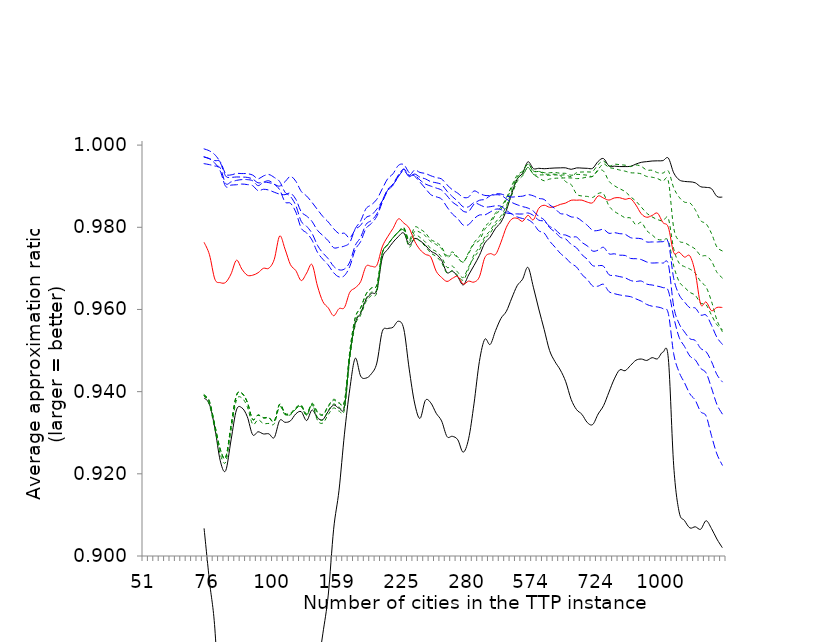
| Category | S1 | S5 | C3 | C4 | C5 | C6 | MATLS | MMASls3boost | MMASls3 | MMASls4boost | MMASls4 |
|---|---|---|---|---|---|---|---|---|---|---|---|
| 51.0 | 0.946 | 0.999 | 0.999 | 0.999 | 0.999 | 1 | 0.98 | 1 | 0.999 | 1 | 0.999 |
| 51.0 | 0.866 | 1 | 1 | 1 | 1 | 1 | 0.956 | 1 | 1 | 1 | 1 |
| 51.0 | 0.866 | 0.9 | 0.9 | 0.9 | 0.9 | 0.901 | 0.997 | 0.988 | 0.988 | 0.998 | 0.994 |
| 51.0 | 0.89 | 0.898 | 0.898 | 0.898 | 0.898 | 0.898 | 0.999 | 1 | 1 | 1 | 1 |
| 51.0 | 0.84 | 0.855 | 0.855 | 0.856 | 0.855 | 0.856 | 0.971 | 1 | 0.991 | 1 | 0.991 |
| 51.0 | 0.856 | 0.857 | 0.857 | 0.857 | 0.857 | 0.857 | 0.942 | 0.996 | 0.996 | 0.997 | 0.996 |
| 51.0 | 0.982 | 0.992 | 0.993 | 0.993 | 0.993 | 0.993 | 0.973 | 1 | 0.996 | 1 | 0.996 |
| 51.0 | 0.925 | 0.967 | 0.967 | 0.967 | 0.967 | 0.967 | 0.94 | 1 | 1 | 1 | 1 |
| 51.0 | 0.932 | 0.956 | 0.96 | 0.96 | 0.96 | 0.96 | 0.997 | 1 | 0.996 | 1 | 0.996 |
| 51.0 | 0.908 | 0.925 | 0.925 | 0.925 | 0.925 | 0.925 | 0.993 | 1 | 1 | 1 | 1 |
| 51.0 | 0.945 | 0.959 | 0.961 | 0.961 | 0.961 | 0.961 | 0.975 | 0.992 | 0.99 | 0.997 | 0.995 |
| 51.0 | 0.925 | 0.953 | 0.953 | 0.953 | 0.953 | 0.953 | 0.995 | 0.991 | 0.991 | 0.996 | 0.997 |
| 76.0 | 0.792 | 0.98 | 0.98 | 0.971 | 0.98 | 0.981 | 0.943 | 0.994 | 0.996 | 0.994 | 0.993 |
| 76.0 | 0.726 | 0.93 | 0.93 | 0.93 | 0.93 | 0.93 | 0.885 | 0.994 | 0.996 | 0.989 | 0.987 |
| 76.0 | 0.575 | 0.804 | 0.831 | 0.827 | 0.831 | 0.831 | 0.987 | 0.985 | 0.982 | 0.976 | 0.971 |
| 76.0 | 0.602 | 0.869 | 0.874 | 0.874 | 0.874 | 0.874 | 1 | 0.964 | 0.955 | 0.96 | 0.955 |
| 76.0 | 0.882 | 0.945 | 0.949 | 0.949 | 0.949 | 0.949 | 0.996 | 0.997 | 0.996 | 0.996 | 0.995 |
| 76.0 | 0.876 | 0.944 | 0.944 | 0.944 | 0.944 | 0.944 | 0.981 | 1 | 1 | 0.998 | 0.997 |
| 76.0 | 0.889 | 0.998 | 0.999 | 0.999 | 0.999 | 0.999 | 0.947 | 1 | 0.998 | 1 | 0.998 |
| 76.0 | 0.757 | 0.942 | 0.942 | 0.942 | 0.942 | 0.942 | 0.922 | 1 | 1 | 0.999 | 0.998 |
| 76.0 | 0.736 | 0.903 | 0.91 | 0.909 | 0.91 | 0.91 | 0.997 | 0.996 | 0.992 | 0.995 | 0.992 |
| 76.0 | 0.817 | 0.933 | 0.938 | 0.938 | 0.938 | 0.938 | 1 | 0.989 | 0.986 | 0.989 | 0.985 |
| 76.0 | 0.856 | 0.953 | 0.953 | 0.95 | 0.953 | 0.953 | 0.988 | 1 | 1 | 0.999 | 0.999 |
| 76.0 | 0.775 | 0.954 | 0.954 | 0.954 | 0.954 | 0.954 | 0.995 | 0.995 | 0.995 | 0.995 | 0.995 |
| 100.0 | 0.844 | 0.97 | 0.97 | 0.97 | 0.97 | 0.971 | 0.969 | 0.986 | 0.986 | 0.989 | 0.987 |
| 100.0 | 0.796 | 0.98 | 0.98 | 0.98 | 0.98 | 0.98 | 0.953 | 0.982 | 0.98 | 0.983 | 0.982 |
| 100.0 | 0.799 | 0.799 | 0.802 | 0.803 | 0.803 | 0.804 | 0.948 | 0.954 | 0.946 | 0.989 | 0.969 |
| 100.0 | 0.871 | 0.873 | 0.874 | 0.875 | 0.874 | 0.875 | 0.955 | 0.952 | 0.951 | 0.976 | 0.96 |
| 100.0 | 0.966 | 0.966 | 0.965 | 0.966 | 0.966 | 0.966 | 0.978 | 0.971 | 0.97 | 0.982 | 0.977 |
| 100.0 | 0.951 | 0.951 | 0.952 | 0.952 | 0.952 | 0.952 | 0.952 | 0.954 | 0.953 | 0.969 | 0.961 |
| 100.0 | 0.968 | 0.972 | 0.973 | 0.973 | 0.973 | 0.974 | 0.968 | 0.985 | 0.985 | 0.986 | 0.986 |
| 100.0 | 0.947 | 0.972 | 0.972 | 0.972 | 0.972 | 0.972 | 0.947 | 0.979 | 0.979 | 0.981 | 0.983 |
| 100.0 | 0.875 | 0.88 | 0.864 | 0.873 | 0.885 | 0.885 | 0.934 | 0.961 | 0.957 | 0.975 | 0.966 |
| 100.0 | 0.927 | 0.928 | 0.929 | 0.929 | 0.929 | 0.929 | 0.954 | 0.967 | 0.965 | 0.969 | 0.97 |
| 100.0 | 0.969 | 0.977 | 0.978 | 0.978 | 0.978 | 0.978 | 0.97 | 0.983 | 0.983 | 0.983 | 0.984 |
| 100.0 | 0.967 | 0.972 | 0.973 | 0.973 | 0.973 | 0.973 | 0.972 | 0.973 | 0.973 | 0.975 | 0.975 |
| 159.0 | 0.958 | 0.96 | 0.961 | 0.961 | 0.961 | 0.961 | 0.99 | 0.976 | 0.973 | 0.975 | 0.989 |
| 159.0 | 0.959 | 0.984 | 0.984 | 0.984 | 0.984 | 0.984 | 0.956 | 0.984 | 0.984 | 0.984 | 0.985 |
| 159.0 | 0.932 | 0.95 | 0.95 | 0.95 | 0.95 | 0.95 | 0.993 | 0.974 | 0.973 | 0.976 | 0.98 |
| 159.0 | 0.96 | 0.968 | 0.972 | 0.972 | 0.972 | 0.972 | 0.968 | 1 | 1 | 1 | 1 |
| 159.0 | 0.914 | 0.994 | 0.995 | 0.995 | 0.995 | 0.995 | 0.996 | 0.995 | 0.994 | 0.995 | 1 |
| 159.0 | 0.945 | 0.991 | 0.991 | 0.991 | 0.991 | 0.991 | 0.997 | 0.991 | 0.991 | 0.991 | 0.997 |
| 159.0 | 0.98 | 0.991 | 0.991 | 0.991 | 0.991 | 0.991 | 0.969 | 0.997 | 0.999 | 0.993 | 0.997 |
| 159.0 | 0.978 | 0.981 | 0.982 | 0.982 | 0.982 | 0.982 | 0.95 | 0.998 | 1 | 0.998 | 0.999 |
| 159.0 | 0.967 | 0.975 | 0.978 | 0.978 | 0.978 | 0.978 | 0.988 | 0.999 | 0.997 | 0.998 | 0.997 |
| 159.0 | 0.936 | 0.953 | 0.954 | 0.954 | 0.954 | 0.954 | 0.984 | 1 | 1 | 1 | 1 |
| 159.0 | 0.973 | 0.998 | 0.999 | 0.999 | 0.999 | 0.999 | 0.995 | 0.999 | 0.999 | 0.999 | 0.999 |
| 159.0 | 0.985 | 0.989 | 0.989 | 0.989 | 0.989 | 0.989 | 1 | 0.999 | 0.999 | 0.999 | 0.999 |
| 225.0 | 0.935 | 0.97 | 0.969 | 0.965 | 0.971 | 0.974 | 0.978 | 0.992 | 0.995 | 0.991 | 0.991 |
| 225.0 | 0.842 | 0.949 | 0.946 | 0.936 | 0.947 | 0.948 | 0.942 | 0.967 | 0.964 | 0.967 | 0.962 |
| 225.0 | 0.832 | 0.968 | 0.972 | 0.977 | 0.979 | 0.987 | 0.955 | 0.99 | 0.975 | 0.983 | 0.97 |
| 225.0 | 0.915 | 0.961 | 0.964 | 0.963 | 0.97 | 0.966 | 0.943 | 0.993 | 0.985 | 0.99 | 0.982 |
| 225.0 | 0.967 | 0.981 | 0.981 | 0.979 | 0.984 | 0.984 | 0.982 | 0.992 | 0.983 | 0.99 | 0.981 |
| 225.0 | 0.937 | 0.973 | 0.973 | 0.972 | 0.975 | 0.972 | 0.989 | 0.985 | 0.985 | 0.983 | 0.979 |
| 225.0 | 0.95 | 0.982 | 0.983 | 0.981 | 0.982 | 0.983 | 0.927 | 0.991 | 0.994 | 0.99 | 0.991 |
| 225.0 | 0.955 | 0.963 | 0.965 | 0.964 | 0.969 | 0.968 | 0.931 | 0.994 | 0.994 | 0.992 | 0.992 |
| 225.0 | 0.921 | 0.939 | 0.948 | 0.947 | 0.952 | 0.952 | 0.976 | 0.982 | 0.981 | 0.979 | 0.974 |
| 225.0 | 0.936 | 0.957 | 0.958 | 0.961 | 0.966 | 0.965 | 0.993 | 0.986 | 0.981 | 0.984 | 0.979 |
| 225.0 | 0.963 | 0.981 | 0.981 | 0.985 | 0.986 | 0.984 | 1 | 0.989 | 0.988 | 0.985 | 0.985 |
| 225.0 | 0.949 | 0.965 | 0.974 | 0.976 | 0.976 | 0.975 | 0.978 | 0.987 | 0.984 | 0.983 | 0.981 |
| 280.0 | 0.974 | 0.999 | 0.999 | 0.998 | 1 | 0.999 | 0.986 | 0.993 | 0.994 | 0.992 | 0.992 |
| 280.0 | 0.945 | 0.977 | 0.974 | 0.977 | 0.976 | 0.976 | 0.939 | 0.985 | 0.986 | 0.979 | 0.979 |
| 280.0 | 0.956 | 0.997 | 0.994 | 0.999 | 0.997 | 0.998 | 0.97 | 0.983 | 0.986 | 0.978 | 0.981 |
| 280.0 | 0.98 | 0.998 | 0.996 | 0.993 | 0.998 | 0.998 | 0.999 | 0.987 | 0.987 | 0.984 | 0.982 |
| 280.0 | 0.951 | 0.999 | 0.999 | 0.998 | 1 | 0.999 | 0.994 | 0.991 | 0.993 | 0.991 | 0.99 |
| 280.0 | 0.978 | 1 | 0.997 | 0.997 | 1 | 0.999 | 0.987 | 0.987 | 0.99 | 0.986 | 0.987 |
| 280.0 | 0.986 | 0.999 | 0.999 | 0.999 | 0.999 | 0.999 | 0.963 | 0.99 | 0.993 | 0.989 | 0.99 |
| 280.0 | 0.976 | 0.998 | 0.997 | 0.993 | 0.996 | 0.996 | 0.975 | 0.984 | 0.988 | 0.98 | 0.982 |
| 280.0 | 0.96 | 0.989 | 0.986 | 0.991 | 0.987 | 0.987 | 1 | 0.972 | 0.977 | 0.969 | 0.972 |
| 280.0 | 0.972 | 0.999 | 0.997 | 0.996 | 0.997 | 0.996 | 0.995 | 0.979 | 0.983 | 0.976 | 0.978 |
| 280.0 | 0.981 | 0.999 | 0.997 | 0.996 | 0.998 | 0.998 | 0.991 | 0.984 | 0.989 | 0.981 | 0.985 |
| 280.0 | 0.983 | 0.999 | 0.998 | 0.998 | 0.998 | 0.998 | 0.995 | 0.983 | 0.988 | 0.98 | 0.984 |
| 574.0 | 0.916 | 0.979 | 0.98 | 0.978 | 0.978 | 0.979 | 0.974 | 0.984 | 0.99 | 0.98 | 0.985 |
| 574.0 | 0.881 | 0.978 | 0.973 | 0.967 | 0.975 | 0.975 | 0.972 | 0.969 | 0.978 | 0.958 | 0.965 |
| 574.0 | 0.896 | 0.996 | 0.994 | 0.99 | 0.989 | 0.994 | 0.979 | 0.973 | 0.983 | 0.971 | 0.978 |
| 574.0 | 0.919 | 0.999 | 0.995 | 0.998 | 0.997 | 0.998 | 0.993 | 0.964 | 0.972 | 0.96 | 0.967 |
| 574.0 | 0.919 | 1 | 1 | 1 | 1 | 1 | 0.996 | 0.978 | 0.983 | 0.973 | 0.981 |
| 574.0 | 0.953 | 1 | 0.996 | 0.997 | 0.996 | 0.997 | 0.993 | 0.972 | 0.976 | 0.967 | 0.972 |
| 574.0 | 0.951 | 0.999 | 1 | 1 | 0.982 | 0.999 | 0.967 | 0.985 | 0.992 | 0.976 | 0.988 |
| 574.0 | 0.925 | 0.994 | 0.992 | 0.993 | 0.988 | 0.991 | 0.983 | 0.968 | 0.98 | 0.964 | 0.975 |
| 574.0 | 0.93 | 0.993 | 0.998 | 0.989 | 0.96 | 0.989 | 1 | 0.962 | 0.976 | 0.958 | 0.973 |
| 574.0 | 0.958 | 0.998 | 0.999 | 0.998 | 0.991 | 0.995 | 0.995 | 0.959 | 0.972 | 0.954 | 0.962 |
| 574.0 | 0.958 | 0.998 | 0.997 | 0.999 | 0.997 | 0.997 | 0.985 | 0.97 | 0.976 | 0.966 | 0.975 |
| 574.0 | 0.978 | 0.999 | 1 | 1 | 0.995 | 0.995 | 0.993 | 0.965 | 0.973 | 0.961 | 0.969 |
| 724.0 | 0.946 | 0.999 | 1 | 0.998 | 0.99 | 0.995 | 0.993 | 0.984 | 0.99 | 0.98 | 0.987 |
| 724.0 | 0.905 | 0.986 | 0.983 | 0.982 | 0.974 | 0.974 | 0.966 | 0.968 | 0.982 | 0.963 | 0.974 |
| 724.0 | 0.936 | 0.974 | 0.98 | 0.98 | 0.954 | 0.965 | 0.974 | 0.948 | 0.972 | 0.95 | 0.959 |
| 724.0 | 0.958 | 0.998 | 1 | 0.995 | 0.981 | 0.985 | 0.999 | 0.962 | 0.974 | 0.954 | 0.967 |
| 724.0 | 0.945 | 0.998 | 0.999 | 0.995 | 0.99 | 0.991 | 0.997 | 0.975 | 0.98 | 0.969 | 0.977 |
| 724.0 | 0.951 | 1 | 0.995 | 0.994 | 0.986 | 0.988 | 0.989 | 0.968 | 0.974 | 0.965 | 0.972 |
| 724.0 | 0.967 | 1 | 0.996 | 0.995 | 0.981 | 0.984 | 0.969 | 0.977 | 0.982 | 0.973 | 0.979 |
| 724.0 | 0.94 | 1 | 0.997 | 0.992 | 0.968 | 0.978 | 0.965 | 0.965 | 0.978 | 0.957 | 0.975 |
| 724.0 | 0.934 | 0.998 | 0.993 | 0.986 | 0.967 | 0.971 | 0.974 | 0.963 | 0.974 | 0.952 | 0.97 |
| 724.0 | 0.954 | 1 | 0.989 | 0.99 | 0.967 | 0.978 | 0.986 | 0.95 | 0.963 | 0.944 | 0.955 |
| 724.0 | 0.966 | 1 | 0.997 | 0.997 | 0.984 | 0.986 | 0.991 | 0.968 | 0.976 | 0.961 | 0.972 |
| 724.0 | 0.974 | 1 | 0.993 | 0.996 | 0.982 | 0.987 | 1 | 0.961 | 0.973 | 0.959 | 0.969 |
| 1000.0 | 0.966 | 1 | 0.998 | 0.991 | 0.988 | 0.991 | 0.966 | 0.979 | 0.991 | 0.975 | 0.987 |
| 1000.0 | 0.887 | 0.994 | 0.989 | 0.983 | 0.972 | 0.981 | 0.952 | 0.958 | 0.979 | 0.949 | 0.971 |
| 1000.0 | 0.622 | 0.931 | 0.93 | 0.843 | 0.88 | 0.876 | 0.9 | 0.871 | 0.867 | 0.832 | 0.835 |
| 1000.0 | 0.823 | 0.978 | 0.973 | 0.957 | 0.935 | 0.944 | 1 | 0.903 | 0.926 | 0.901 | 0.918 |
| 1000.0 | 0.92 | 0.994 | 0.984 | 0.99 | 0.974 | 0.981 | 0.983 | 0.948 | 0.958 | 0.938 | 0.953 |
| 1000.0 | 0.929 | 0.999 | 0.993 | 0.985 | 0.972 | 0.981 | 0.992 | 0.94 | 0.957 | 0.932 | 0.952 |
| 1000.0 | 0.97 | 0.997 | 0.975 | 0.985 | 0.972 | 0.972 | 0.919 | 0.966 | 0.981 | 0.955 | 0.974 |
| 1000.0 | 0.932 | 0.989 | 0.965 | 0.973 | 0.945 | 0.953 | 0.873 | 0.94 | 0.957 | 0.924 | 0.952 |
| 1000.0 | 0.959 | 0.996 | 0.984 | 0.986 | 0.962 | 0.956 | 0.981 | 0.95 | 0.974 | 0.939 | 0.96 |
| 1000.0 | 0.931 | 0.996 | 0.961 | 0.975 | 0.937 | 0.936 | 0.96 | 0.906 | 0.933 | 0.886 | 0.927 |
| 1000.0 | 0.935 | 0.978 | 0.957 | 0.965 | 0.956 | 0.931 | 1 | 0.92 | 0.941 | 0.908 | 0.934 |
| 1000.0 | 0.949 | 0.998 | 0.981 | 0.979 | 0.968 | 0.954 | 1 | 0.933 | 0.953 | 0.926 | 0.948 |